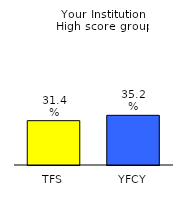
| Category | Series 0 |
|---|---|
| TFS | 0.314 |
| YFCY | 0.352 |